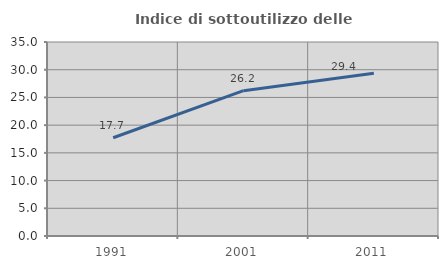
| Category | Indice di sottoutilizzo delle abitazioni  |
|---|---|
| 1991.0 | 17.726 |
| 2001.0 | 26.217 |
| 2011.0 | 29.381 |